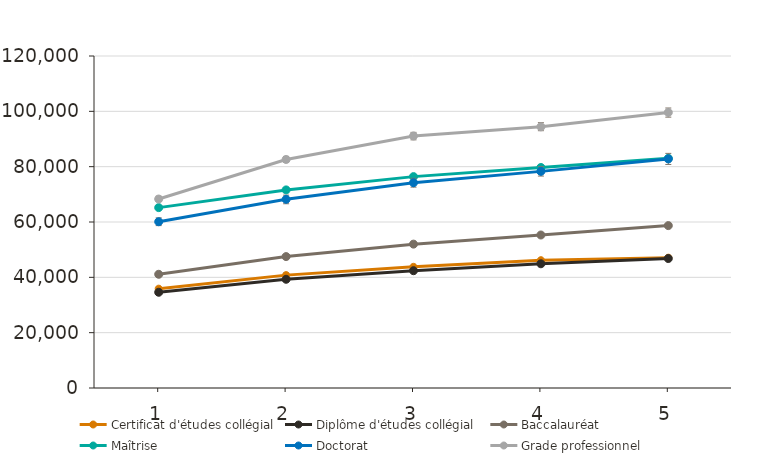
| Category | Certificat d'études collégial | Diplôme d'études collégial | Baccalauréat | Maîtrise | Doctorat | Grade professionnel |
|---|---|---|---|---|---|---|
| 1.0 | 35900 | 34600 | 41100 | 65200 | 60100 | 68300 |
| 2.0 | 40800 | 39300 | 47500 | 71600 | 68200 | 82600 |
| 3.0 | 43800 | 42400 | 52000 | 76400 | 74200 | 91100 |
| 4.0 | 46200 | 44900 | 55300 | 79700 | 78300 | 94400 |
| 5.0 | 47100 | 46800 | 58700 | 83000 | 82800 | 99600 |